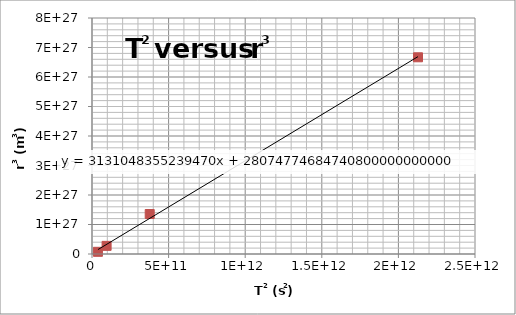
| Category | Series 1 |
|---|---|
| 38703114690.26919 | 74310486338087997610655744 |
| 95300135331.84001 | 275704038652636588553535488 |
| 376713671821.92224 | 1355910408134567908241047552 |
| 2128032086261.7595 | 6668424907333084161318584320 |